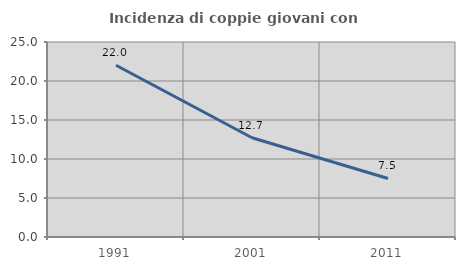
| Category | Incidenza di coppie giovani con figli |
|---|---|
| 1991.0 | 22.014 |
| 2001.0 | 12.719 |
| 2011.0 | 7.502 |